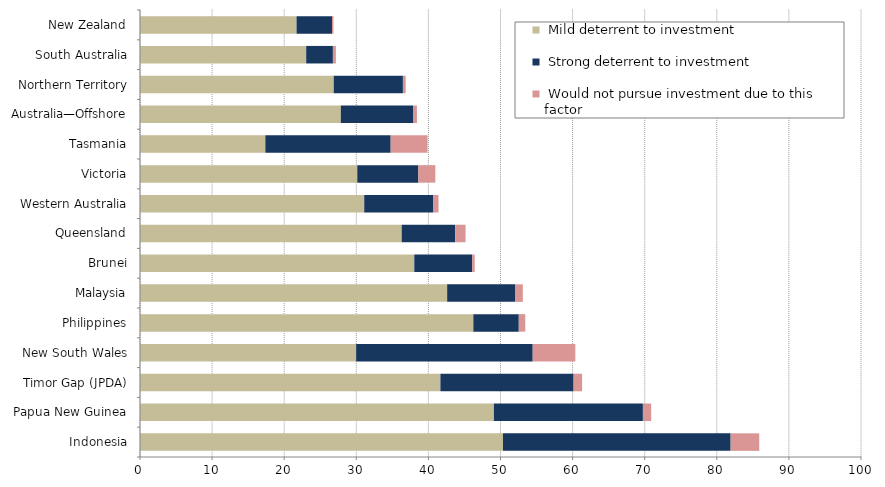
| Category |  Mild deterrent to investment |  Strong deterrent to investment |  Would not pursue investment due to this factor |
|---|---|---|---|
| Indonesia | 50.342 | 31.578 | 3.966 |
| Papua New Guinea | 49.084 | 20.667 | 1.148 |
| Timor Gap (JPDA) | 41.665 | 18.474 | 1.179 |
| New South Wales | 29.978 | 24.489 | 5.911 |
| Philippines | 46.232 | 6.304 | 0.901 |
| Malaysia | 42.601 | 9.467 | 1.029 |
| Brunei | 38.045 | 8.028 | 0.349 |
| Queensland | 36.295 | 7.43 | 1.429 |
| Western Australia | 31.101 | 9.54 | 0.763 |
| Victoria | 30.133 | 8.475 | 2.354 |
| Tasmania | 17.384 | 17.384 | 5.113 |
| Australia—Offshore | 27.853 | 10.012 | 0.546 |
| Northern Territory | 26.869 | 9.596 | 0.384 |
| South Australia | 23.05 | 3.704 | 0.412 |
| New Zealand | 21.713 | 4.916 | 0.205 |